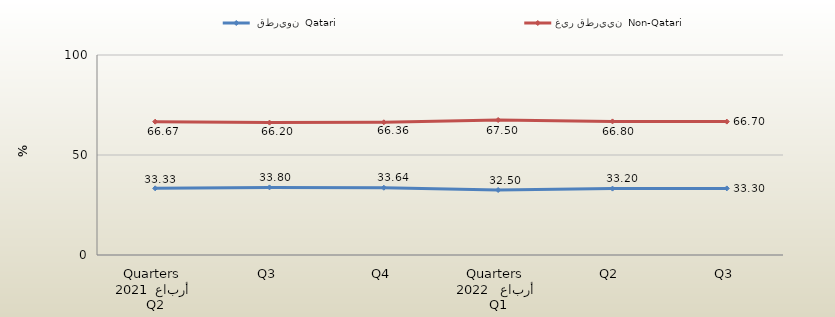
| Category |  قطريون  Qatari | غير قطريين  Non-Qatari |
|---|---|---|
| 0 | 33.333 | 66.667 |
| 1 | 33.8 | 66.2 |
| 2 | 33.641 | 66.359 |
| 3 | 32.5 | 67.5 |
| 4 | 33.2 | 66.8 |
| 5 | 33.3 | 66.7 |